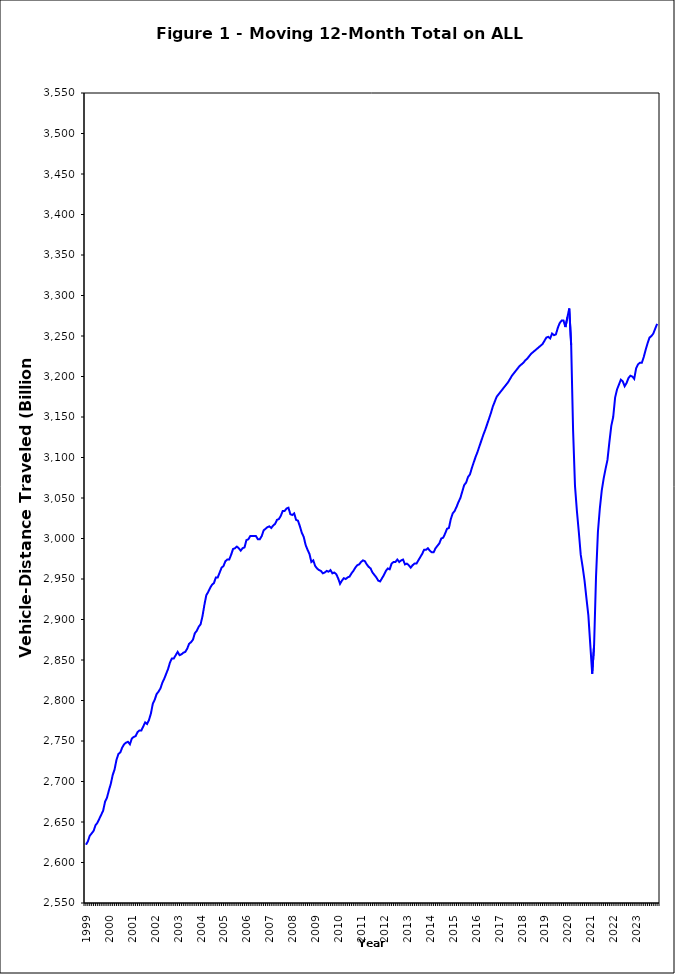
| Category | Annual Vehicle-Distance Traveled (Billion Miles) |
|---|---|
| 1999 | 2622 |
| 1999 | 2626 |
| 1999 | 2633 |
| 1999 | 2636 |
| 1999 | 2639 |
| 1999 | 2646 |
| 1999 | 2649 |
| 1999 | 2654 |
| 1999 | 2659 |
| 1999 | 2664 |
| 1999 | 2675 |
| 1999 | 2680 |
| 2000 | 2689 |
| 2000 | 2697 |
| 2000 | 2708 |
| 2000 | 2715 |
| 2000 | 2727 |
| 2000 | 2734 |
| 2000 | 2736 |
| 2000 | 2742 |
| 2000 | 2746 |
| 2000 | 2748 |
| 2000 | 2749 |
| 2000 | 2746 |
| 2001 | 2753 |
| 2001 | 2755 |
| 2001 | 2756 |
| 2001 | 2761 |
| 2001 | 2763 |
| 2001 | 2763 |
| 2001 | 2768 |
| 2001 | 2773 |
| 2001 | 2771 |
| 2001 | 2776 |
| 2001 | 2784 |
| 2001 | 2796 |
| 2002 | 2801 |
| 2002 | 2808 |
| 2002 | 2811 |
| 2002 | 2815 |
| 2002 | 2822 |
| 2002 | 2827 |
| 2002 | 2833 |
| 2002 | 2839 |
| 2002 | 2847 |
| 2002 | 2852 |
| 2002 | 2852 |
| 2002 | 2856 |
| 2003 | 2860 |
| 2003 | 2856 |
| 2003 | 2857 |
| 2003 | 2859 |
| 2003 | 2860 |
| 2003 | 2864 |
| 2003 | 2870 |
| 2003 | 2872 |
| 2003 | 2875 |
| 2003 | 2883 |
| 2003 | 2886 |
| 2003 | 2891 |
| 2004 | 2894 |
| 2004 | 2904 |
| 2004 | 2918 |
| 2004 | 2930 |
| 2004 | 2934 |
| 2004 | 2939 |
| 2004 | 2943 |
| 2004 | 2945 |
| 2004 | 2952 |
| 2004 | 2952 |
| 2004 | 2958 |
| 2004 | 2964 |
| 2005 | 2966 |
| 2005 | 2972 |
| 2005 | 2974 |
| 2005 | 2974 |
| 2005 | 2980 |
| 2005 | 2987 |
| 2005 | 2988 |
| 2005 | 2990 |
| 2005 | 2988 |
| 2005 | 2985 |
| 2005 | 2988 |
| 2005 | 2989 |
| 2006 | 2998 |
| 2006 | 2999 |
| 2006 | 3003 |
| 2006 | 3003 |
| 2006 | 3003 |
| 2006 | 3003 |
| 2006 | 2999 |
| 2006 | 2999 |
| 2006 | 3003 |
| 2006 | 3010 |
| 2006 | 3012 |
| 2006 | 3014 |
| 2007 | 3015 |
| 2007 | 3013 |
| 2007 | 3016 |
| 2007 | 3018 |
| 2007 | 3023 |
| 2007 | 3024 |
| 2007 | 3028 |
| 2007 | 3034 |
| 2007 | 3034 |
| 2007 | 3037 |
| 2007 | 3038 |
| 2007 | 3030 |
| 2008 | 3029 |
| 2008 | 3031 |
| 2008 | 3023 |
| 2008 | 3022 |
| 2008 | 3015 |
| 2008 | 3007 |
| 2008 | 3002 |
| 2008 | 2992 |
| 2008 | 2986 |
| 2008 | 2981 |
| 2008 | 2971 |
| 2008 | 2973 |
| 2009 | 2966 |
| 2009 | 2963 |
| 2009 | 2961 |
| 2009 | 2960 |
| 2009 | 2957 |
| 2009 | 2958 |
| 2009 | 2960 |
| 2009 | 2959 |
| 2009 | 2961 |
| 2009 | 2957 |
| 2009 | 2958 |
| 2009 | 2956 |
| 2010 | 2951 |
| 2010 | 2944 |
| 2010 | 2948 |
| 2010 | 2951 |
| 2010 | 2950 |
| 2010 | 2952 |
| 2010 | 2953 |
| 2010 | 2957 |
| 2010 | 2960 |
| 2010 | 2964 |
| 2010 | 2967 |
| 2010 | 2968 |
| 2011 | 2971 |
| 2011 | 2973 |
| 2011 | 2972 |
| 2011 | 2968 |
| 2011 | 2965 |
| 2011 | 2963 |
| 2011 | 2958 |
| 2011 | 2955 |
| 2011 | 2952 |
| 2011 | 2948 |
| 2011 | 2947 |
| 2011 | 2951 |
| 2012 | 2955 |
| 2012 | 2960 |
| 2012 | 2963 |
| 2012 | 2962 |
| 2012 | 2969 |
| 2012 | 2971 |
| 2012 | 2971 |
| 2012 | 2974 |
| 2012 | 2971 |
| 2012 | 2973 |
| 2012 | 2974 |
| 2012 | 2968 |
| 2013 | 2969 |
| 2013 | 2967 |
| 2013 | 2964 |
| 2013 | 2967 |
| 2013 | 2969 |
| 2013 | 2969 |
| 2013 | 2973 |
| 2013 | 2977 |
| 2013 | 2981 |
| 2013 | 2986 |
| 2013 | 2986 |
| 2013 | 2988 |
| 2014 | 2985 |
| 2014 | 2983 |
| 2014 | 2983 |
| 2014 | 2988 |
| 2014 | 2991 |
| 2014 | 2994 |
| 2014 | 3000 |
| 2014 | 3001 |
| 2014 | 3006 |
| 2014 | 3012 |
| 2014 | 3013 |
| 2014 | 3024 |
| 2015 | 3031 |
| 2015 | 3034 |
| 2015 | 3039 |
| 2015 | 3045 |
| 2015 | 3050 |
| 2015 | 3058 |
| 2015 | 3066 |
| 2015 | 3069 |
| 2015 | 3076 |
| 2015 | 3079 |
| 2015 | 3087 |
| 2015 | 3094 |
| 2016 | 3101 |
| 2016 | 3107 |
| 2016 | 3114 |
| 2016 | 3121 |
| 2016 | 3128 |
| 2016 | 3134 |
| 2016 | 3141 |
| 2016 | 3148 |
| 2016 | 3155 |
| 2016 | 3163 |
| 2016 | 3169 |
| 2016 | 3175 |
| 2017 | 3178 |
| 2017 | 3181 |
| 2017 | 3184 |
| 2017 | 3187 |
| 2017 | 3190 |
| 2017 | 3193 |
| 2017 | 3197 |
| 2017 | 3201 |
| 2017 | 3204 |
| 2017 | 3207 |
| 2017 | 3210 |
| 2017 | 3213 |
| 2018 | 3215 |
| 2018 | 3217 |
| 2018 | 3220 |
| 2018 | 3222 |
| 2018 | 3225 |
| 2018 | 3228 |
| 2018 | 3230 |
| 2018 | 3232 |
| 2018 | 3234 |
| 2018 | 3236 |
| 2018 | 3238 |
| 2018 | 3240 |
| 2019 | 3244 |
| 2019 | 3248 |
| 2019 | 3249 |
| 2019 | 3247 |
| 2019 | 3253 |
| 2019 | 3251 |
| 2019 | 3252 |
| 2019 | 3260 |
| 2019 | 3266 |
| 2019 | 3269 |
| 2019 | 3269 |
| 2019 | 3261 |
| 2020 | 3273 |
| 2020 | 3284 |
| 2020 | 3239 |
| 2020 | 3134 |
| 2020 | 3065 |
| 2020 | 3034 |
| 2020 | 3008 |
| 2020 | 2980 |
| 2020 | 2965 |
| 2020 | 2948 |
| 2020 | 2926 |
| 2020 | 2905 |
| 2021 | 2869 |
| 2021 | 2833 |
| 2021 | 2868 |
| 2021 | 2952 |
| 2021 | 3008 |
| 2021 | 3037 |
| 2021 | 3059 |
| 2021 | 3074 |
| 2021 | 3086 |
| 2021 | 3097 |
| 2021 | 3119 |
| 2021 | 3139 |
| 2022 | 3150 |
| 2022 | 3174 |
| 2022 | 3184 |
| 2022 | 3190 |
| 2022 | 3196 |
| 2022 | 3194 |
| 2022 | 3188 |
| 2022 | 3192 |
| 2022 | 3198 |
| 2022 | 3201 |
| 2022 | 3200 |
| 2022 | 3197 |
| 2023 | 3210 |
| 2023 | 3215 |
| 2023 | 3217 |
| 2023 | 3217 |
| 2023 | 3224 |
| 2023 | 3233 |
| 2023 | 3241 |
| 2023 | 3248 |
| 2023 | 3250 |
| 2023 | 3253 |
| 2023 | 3259 |
| 2023 | 3265 |